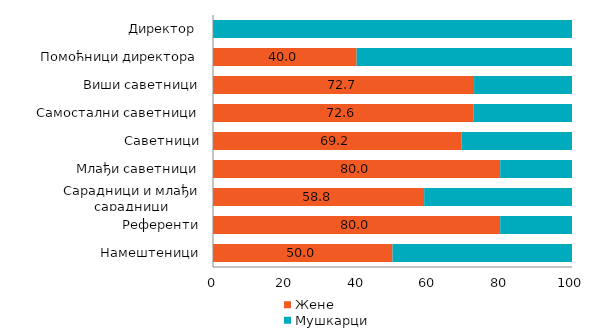
| Category | Жене | Мушкарци  |
|---|---|---|
| Намештеници | 50 | 50 |
| Референти | 80 | 20 |
| Сарадници и млађи сарадници | 58.824 | 41.176 |
| Млађи саветници | 80 | 20 |
| Саветници | 69.182 | 30.818 |
| Самостални саветници | 72.632 | 27.368 |
| Виши саветници | 72.727 | 27.273 |
| Помоћници директора | 40 | 60 |
| Директор  | 0 | 100 |